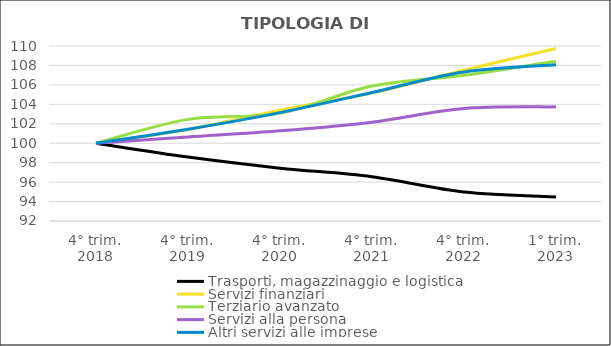
| Category | Trasporti, magazzinaggio e logistica | Servizi finanziari | Terziario avanzato  | Servizi alla persona  | Altri servizi alle imprese |
|---|---|---|---|---|---|
| 4° trim.
2018 | 100 | 100 | 100 | 100 | 100 |
| 4° trim.
2019 | 98.572 | 101.406 | 102.451 | 100.636 | 101.444 |
| 4° trim.
2020 | 97.437 | 103.4 | 103.096 | 101.272 | 103.149 |
| 4° trim.
2021 | 96.558 | 105.165 | 105.877 | 102.165 | 105.221 |
| 4° trim.
2022 | 94.984 | 107.519 | 106.992 | 103.573 | 107.328 |
| 1° trim.
2023 | 94.471 | 109.742 | 108.438 | 103.739 | 108.074 |